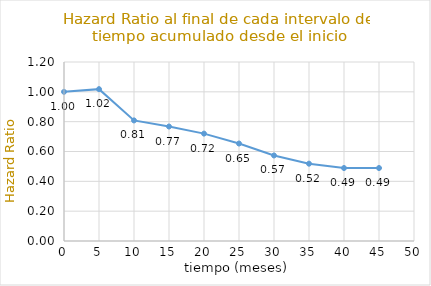
| Category | HRi |
|---|---|
| 0.0 | 1 |
| 5.0 | 1.018 |
| 10.0 | 0.808 |
| 15.0 | 0.767 |
| 20.0 | 0.72 |
| 25.0 | 0.653 |
| 30.0 | 0.573 |
| 35.0 | 0.518 |
| 40.0 | 0.489 |
| 45.0 | 0.489 |